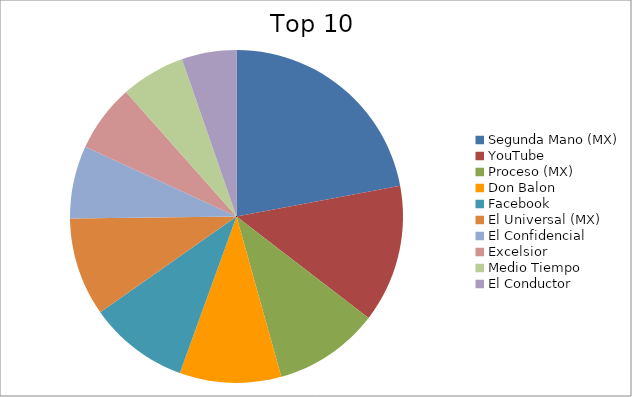
| Category | Series 0 |
|---|---|
| Segunda Mano (MX) | 5.9 |
| YouTube | 3.58 |
| Proceso (MX) | 2.74 |
| Don Balon | 2.64 |
| Facebook | 2.6 |
| El Universal (MX) | 2.56 |
| El Confidencial | 1.89 |
| Excelsior | 1.76 |
| Medio Tiempo | 1.67 |
| El Conductor | 1.42 |